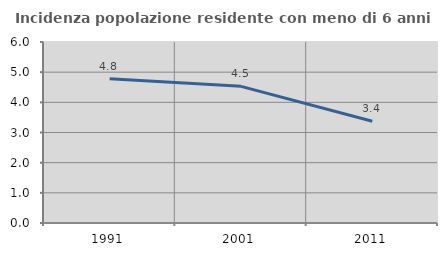
| Category | Incidenza popolazione residente con meno di 6 anni |
|---|---|
| 1991.0 | 4.778 |
| 2001.0 | 4.53 |
| 2011.0 | 3.373 |